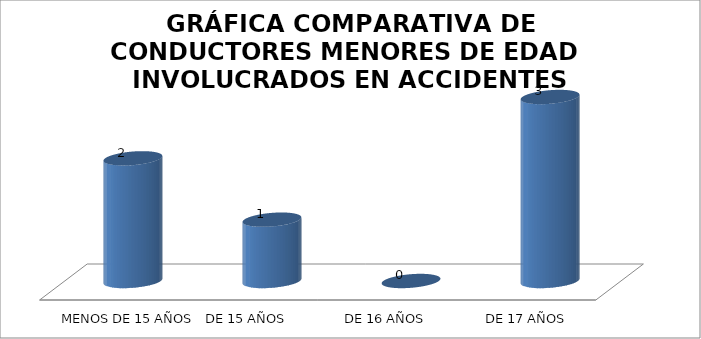
| Category | Series 0 |
|---|---|
| MENOS DE 15 AÑOS | 2 |
| DE 15 AÑOS | 1 |
| DE 16 AÑOS | 0 |
|  DE 17 AÑOS | 3 |